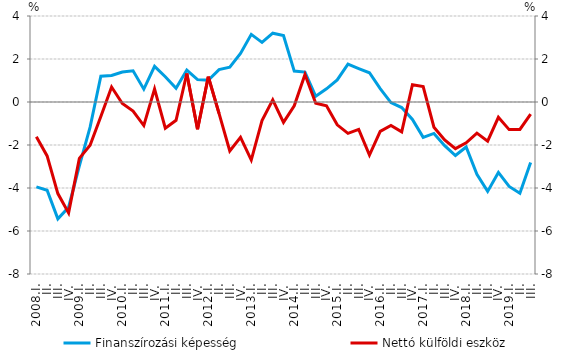
| Category | Finanszírozási képesség |
|---|---|
| 2008.I. | -3.95 |
| II. | -4.109 |
| III. | -5.436 |
| IV. | -4.893 |
| 2009.I. | -2.971 |
| II. | -1.169 |
| III. | 1.199 |
| IV. | 1.235 |
| 2010.I. | 1.394 |
| II. | 1.45 |
| III. | 0.598 |
| IV. | 1.657 |
| 2011.I. | 1.174 |
| II. | 0.64 |
| III. | 1.485 |
| IV. | 1.046 |
| 2012.I. | 1.009 |
| II. | 1.506 |
| III. | 1.621 |
| IV. | 2.255 |
| 2013.I. | 3.146 |
| II. | 2.775 |
| III. | 3.202 |
| IV. | 3.092 |
| 2014.I. | 1.437 |
| II. | 1.392 |
| III. | 0.265 |
| IV. | 0.615 |
| 2015.I. | 1.029 |
| II. | 1.762 |
| III. | 1.557 |
| IV. | 1.361 |
| 2016.I. | 0.624 |
| II. | -0.028 |
| III. | -0.259 |
| IV. | -0.812 |
| 2017.I. | -1.642 |
| II. | -1.461 |
| III. | -2.03 |
| IV. | -2.491 |
| 2018.I. | -2.092 |
| II. | -3.366 |
| III. | -4.157 |
| IV. | -3.277 |
| 2019.I. | -3.929 |
| II. | -4.244 |
| III. | -2.814 |